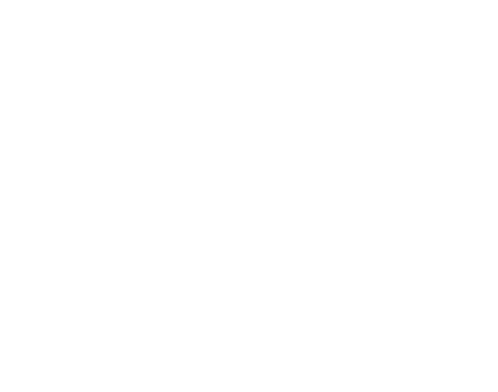
| Category | Tons |
|---|---|
| Currently Disposed as Refuse | 0 |
| Currently Collected Separately as Yard Trimmings | 0 |